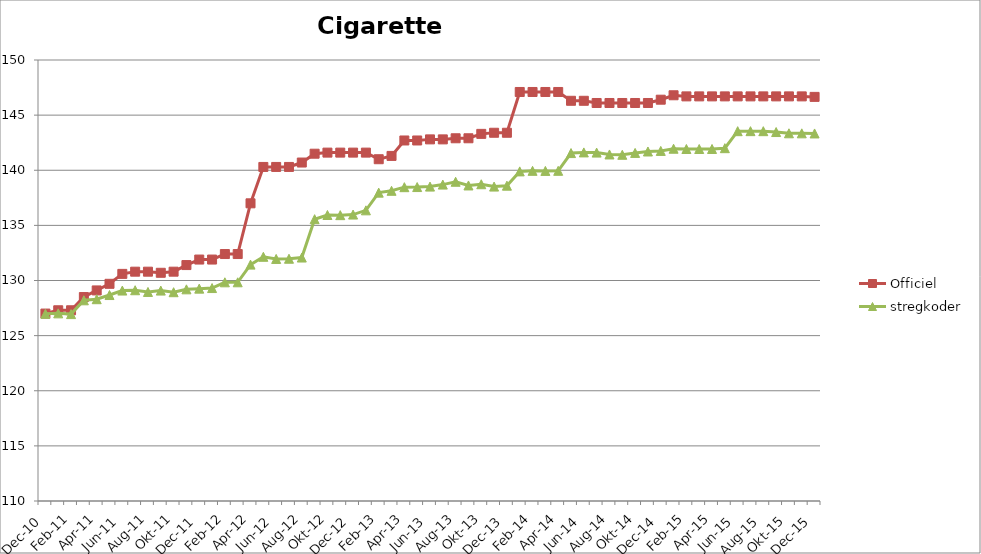
| Category | Officiel | stregkoder |
|---|---|---|
|  Dec-10 | 127 | 126.978 |
|  Jan-11 | 127.3 | 127.02 |
|  Feb-11 | 127.3 | 126.953 |
|  Mar-11 | 128.5 | 128.204 |
|  Apr-11 | 129.1 | 128.302 |
|  Maj-11 | 129.7 | 128.682 |
|  Jun-11 | 130.6 | 129.088 |
|  Jul-11 | 130.8 | 129.117 |
|  Aug-11 | 130.8 | 128.961 |
|  Sep-11 | 130.7 | 129.085 |
|  Okt-11 | 130.8 | 128.937 |
|  Nov-11 | 131.4 | 129.199 |
|  Dec-11 | 131.9 | 129.263 |
|  Jan-12 | 131.9 | 129.315 |
|  Feb-12 | 132.4 | 129.836 |
|  Mar-12 | 132.4 | 129.838 |
|  Apr-12 | 137 | 131.441 |
|  Maj-12 | 140.3 | 132.15 |
|  Jun-12 | 140.3 | 131.956 |
|  Jul-12 | 140.3 | 131.974 |
|  Aug-12 | 140.7 | 132.083 |
|  Sep-12 | 141.5 | 135.56 |
|  Okt-12 | 141.6 | 135.94 |
|  Nov-12 | 141.6 | 135.928 |
|  Dec-12 | 141.6 | 135.98 |
|  Jan-13 | 141.6 | 136.365 |
|  Feb-13 | 141 | 137.97 |
|  Mar-13 | 141.3 | 138.135 |
|  Apr-13 | 142.7 | 138.465 |
|  Maj-13 | 142.7 | 138.476 |
|  Jun-13 | 142.8 | 138.517 |
|  Jul-13 | 142.8 | 138.699 |
|  Aug-13 | 142.9 | 138.954 |
|  Sep-13 | 142.9 | 138.62 |
|  Okt-13 | 143.3 | 138.73 |
|  Nov-13 | 143.4 | 138.518 |
|  Dec-13 | 143.4 | 138.601 |
|  Jan-14 | 147.1 | 139.897 |
|  Feb-14 | 147.1 | 139.947 |
|  Mar-14 | 147.1 | 139.939 |
|  Apr-14 | 147.1 | 139.948 |
|  Maj-14 | 146.3 | 141.557 |
|  Jun-14 | 146.3 | 141.617 |
|  Jul-14 | 146.1 | 141.602 |
|  Aug-14 | 146.1 | 141.432 |
|  Sep-14 | 146.1 | 141.402 |
|  Okt-14 | 146.1 | 141.572 |
|  Nov-14 | 146.1 | 141.701 |
|  Dec-14 | 146.4 | 141.753 |
|  Jan-15 | 146.8 | 141.951 |
|  Feb-15 | 146.7 | 141.927 |
|  Mar-15 | 146.7 | 141.927 |
|  Apr-15 | 146.7 | 141.93 |
|  Maj-15 | 146.7 | 142.002 |
| Jun-15 | 146.7 | 143.544 |
| Jul-15 | 146.7 | 143.546 |
| Aug-15 | 146.7 | 143.543 |
| Sep-15 | 146.7 | 143.465 |
| Okt-15 | 146.7 | 143.353 |
| Nov-15 | 146.7 | 143.349 |
| Dec-15 | 146.655 | 143.337 |